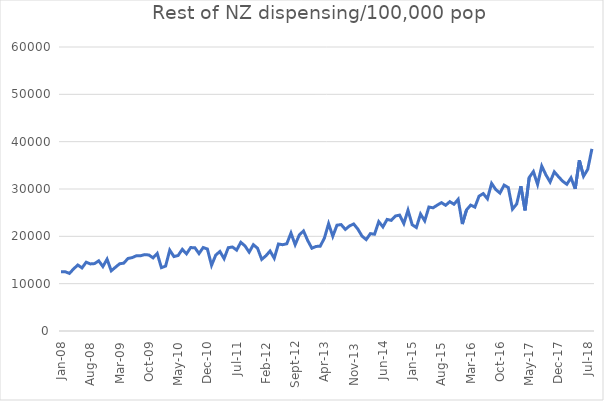
| Category | Series 0 |
|---|---|
| 2008-01-01 | 12497.367 |
| 2008-02-01 | 12515.452 |
| 2008-03-01 | 12168.884 |
| 2008-04-01 | 13127.656 |
| 2008-05-01 | 13942.05 |
| 2008-06-01 | 13330.793 |
| 2008-07-01 | 14534.599 |
| 2008-08-01 | 14170.616 |
| 2008-09-01 | 14237.597 |
| 2008-10-01 | 14830.354 |
| 2008-11-01 | 13620.519 |
| 2008-12-01 | 15171.933 |
| 2009-01-01 | 12720.297 |
| 2009-02-01 | 13460.715 |
| 2009-03-01 | 14200.715 |
| 2009-04-01 | 14336.809 |
| 2009-05-01 | 15325.431 |
| 2009-06-01 | 15502.915 |
| 2009-07-01 | 15889.098 |
| 2009-08-01 | 15899.638 |
| 2009-09-01 | 16135.112 |
| 2009-10-01 | 16059.804 |
| 2009-11-01 | 15450.903 |
| 2009-12-01 | 16384.517 |
| 2010-01-01 | 13385.928 |
| 2010-02-01 | 13708.033 |
| 2010-03-01 | 17082.198 |
| 2010-04-01 | 15723.172 |
| 2010-05-01 | 15954.207 |
| 2010-06-01 | 17250.87 |
| 2010-07-01 | 16310.038 |
| 2010-08-01 | 17619.431 |
| 2010-09-01 | 17602.166 |
| 2010-10-01 | 16360.522 |
| 2010-11-01 | 17637.894 |
| 2010-12-01 | 17321.866 |
| 2011-01-01 | 13886.348 |
| 2011-02-01 | 16035.946 |
| 2011-03-01 | 16801.248 |
| 2011-04-01 | 15281.825 |
| 2011-05-01 | 17603.961 |
| 2011-06-01 | 17746.026 |
| 2011-07-01 | 17089.065 |
| 2011-08-01 | 18737.299 |
| 2011-09-01 | 17976.561 |
| 2011-10-01 | 16663.065 |
| 2011-11-01 | 18231.716 |
| 2011-12-01 | 17482.758 |
| 2012-01-01 | 15133.087 |
| 2012-02-01 | 15887.046 |
| 2012-03-01 | 16897.484 |
| 2012-04-01 | 15368.31 |
| 2012-05-01 | 18374.479 |
| 2012-06-01 | 18231.284 |
| 2012-07-01 | 18429.929 |
| 2012-08-01 | 20694.889 |
| 2012-09-01 | 18228.925 |
| 2012-10-01 | 20308.193 |
| 2012-11-01 | 21131.53 |
| 2012-12-01 | 19118.284 |
| 2013-01-01 | 17481.916 |
| 2013-02-01 | 17864.154 |
| 2013-03-01 | 17919.849 |
| 2013-04-01 | 19630.352 |
| 2013-05-01 | 22685.396 |
| 2013-06-01 | 20010.393 |
| 2013-07-01 | 22353.015 |
| 2013-08-01 | 22483.289 |
| 2013-09-01 | 21466.263 |
| 2013-10-01 | 22187.809 |
| 2013-11-01 | 22614.983 |
| 2013-12-01 | 21533.668 |
| 2014-01-01 | 20041.687 |
| 2014-02-01 | 19315.494 |
| 2014-03-01 | 20573.029 |
| 2014-04-01 | 20443.632 |
| 2014-05-01 | 23101.738 |
| 2014-06-01 | 21992.876 |
| 2014-07-01 | 23571.994 |
| 2014-08-01 | 23375.715 |
| 2014-09-01 | 24298.325 |
| 2014-10-01 | 24486.18 |
| 2014-11-01 | 22696.909 |
| 2014-12-01 | 25525.907 |
| 2015-01-01 | 22449.66 |
| 2015-02-01 | 21861.731 |
| 2015-03-01 | 24709.26 |
| 2015-04-01 | 23268.69 |
| 2015-05-01 | 26188.912 |
| 2015-06-01 | 26025.536 |
| 2015-07-01 | 26593.483 |
| 2015-08-01 | 27115.38 |
| 2015-09-01 | 26562.403 |
| 2015-10-01 | 27322.573 |
| 2015-11-01 | 26777.911 |
| 2015-12-01 | 27821.897 |
| 2016-01-01 | 22596.156 |
| 2016-02-01 | 25582.756 |
| 2016-03-01 | 26597.243 |
| 2016-04-01 | 26171.94 |
| 2016-05-01 | 28487.435 |
| 2016-06-01 | 29030.898 |
| 2016-07-01 | 27934.764 |
| 2016-08-01 | 31183.032 |
| 2016-09-01 | 29886.957 |
| 2016-10-01 | 29141.134 |
| 2016-11-01 | 30816.243 |
| 2016-12-01 | 30300.444 |
| 2017-01-01 | 25751.616 |
| 2017-02-01 | 26823.635 |
| 2017-03-01 | 30603.875 |
| 2017-04-01 | 25487.698 |
| 2017-05-01 | 32430.81 |
| 2017-06-01 | 33680.451 |
| 2017-07-01 | 30969.805 |
| 2017-08-01 | 34840.517 |
| 2017-09-01 | 32976.226 |
| 2017-10-01 | 31479.189 |
| 2017-11-01 | 33623.608 |
| 2017-12-01 | 32604.638 |
| 2018-01-01 | 31651.063 |
| 2018-02-01 | 30998.535 |
| 2018-03-01 | 32366.995 |
| 2018-04-01 | 30032.673 |
| 2018-05-01 | 36057.673 |
| 2018-06-01 | 32698.709 |
| 2018-07-01 | 34153.169 |
| 2018-08-01 | 38478.263 |